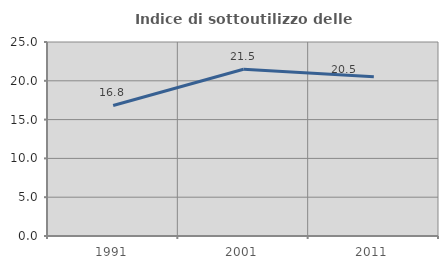
| Category | Indice di sottoutilizzo delle abitazioni  |
|---|---|
| 1991.0 | 16.822 |
| 2001.0 | 21.484 |
| 2011.0 | 20.513 |